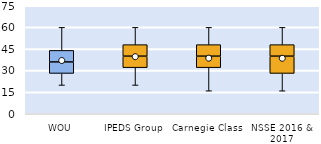
| Category | 25th | 50th | 75th |
|---|---|---|---|
| WOU | 28 | 8 | 8 |
| IPEDS Group | 32 | 8 | 8 |
| Carnegie Class | 32 | 8 | 8 |
| NSSE 2016 & 2017 | 28 | 12 | 8 |